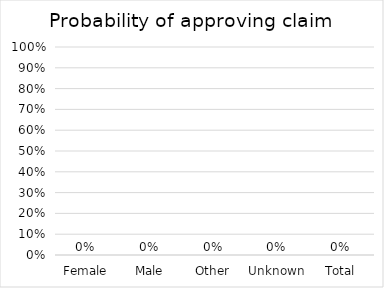
| Category |  Probability of approving claim  |
|---|---|
| Female | 0 |
| Male | 0 |
| Other | 0 |
| Unknown | 0 |
| Total | 0 |